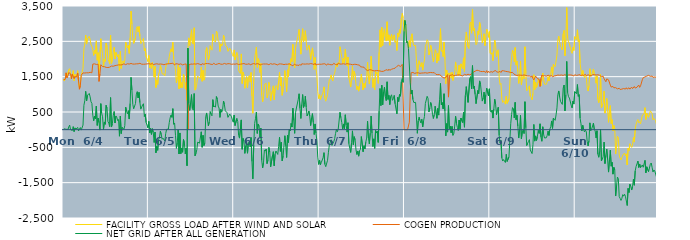
| Category | FACILITY GROSS LOAD AFTER WIND AND SOLAR | COGEN PRODUCTION | NET GRID AFTER ALL GENERATION |
|---|---|---|---|
|  Mon  6/4 | 1419 | 1411 | 8 |
|  Mon  6/4 | 1376 | 1393 | -17 |
|  Mon  6/4 | 1450 | 1423 | 27 |
|  Mon  6/4 | 1601 | 1609 | -8 |
|  Mon  6/4 | 1490 | 1466 | 24 |
|  Mon  6/4 | 1513 | 1519 | -6 |
|  Mon  6/4 | 1694 | 1616 | 78 |
|  Mon  6/4 | 1727 | 1598 | 129 |
|  Mon  6/4 | 1581 | 1581 | 0 |
|  Mon  6/4 | 1433 | 1438 | -5 |
|  Mon  6/4 | 1554 | 1576 | -22 |
|  Mon  6/4 | 1673 | 1588 | 85 |
|  Mon  6/4 | 1387 | 1440 | -53 |
|  Mon  6/4 | 1565 | 1514 | 51 |
|  Mon  6/4 | 1490 | 1476 | 14 |
|  Mon  6/4 | 1548 | 1527 | 21 |
|  Mon  6/4 | 1669 | 1605 | 64 |
|  Mon  6/4 | 1340 | 1376 | -36 |
|  Mon  6/4 | 1170 | 1145 | 25 |
|  Mon  6/4 | 1311 | 1251 | 60 |
|  Mon  6/4 | 1529 | 1541 | -12 |
|  Mon  6/4 | 1539 | 1528 | 11 |
|  Mon  6/4 | 1736 | 1606 | 130 |
|  Mon  6/4 | 2291 | 1603 | 688 |
|  Mon  6/4 | 2423 | 1604 | 819 |
|  Mon  6/4 | 2678 | 1594 | 1084 |
|  Mon  6/4 | 2421 | 1610 | 811 |
|  Mon  6/4 | 2566 | 1592 | 974 |
|  Mon  6/4 | 2592 | 1609 | 983 |
|  Mon  6/4 | 2643 | 1618 | 1025 |
|  Mon  6/4 | 2555 | 1624 | 931 |
|  Mon  6/4 | 2399 | 1610 | 789 |
|  Mon  6/4 | 2353 | 1610 | 743 |
|  Mon  6/4 | 2267 | 1856 | 411 |
|  Mon  6/4 | 2102 | 1849 | 253 |
|  Mon  6/4 | 2249 | 1863 | 386 |
|  Mon  6/4 | 2155 | 1847 | 308 |
|  Mon  6/4 | 2513 | 1845 | 668 |
|  Mon  6/4 | 1965 | 1845 | 120 |
|  Mon  6/4 | 2180 | 1853 | 327 |
|  Mon  6/4 | 1565 | 1366 | 199 |
|  Mon  6/4 | 1563 | 1575 | -12 |
|  Mon  6/4 | 2573 | 1837 | 736 |
|  Mon  6/4 | 2285 | 1825 | 460 |
|  Mon  6/4 | 2154 | 1789 | 365 |
|  Mon  6/4 | 1769 | 1768 | 1 |
|  Mon  6/4 | 2000 | 1782 | 218 |
|  Mon  6/4 | 1933 | 1781 | 152 |
|  Mon  6/4 | 2451 | 1763 | 688 |
|  Mon  6/4 | 2358 | 1751 | 607 |
|  Mon  6/4 | 1992 | 1758 | 234 |
|  Mon  6/4 | 1944 | 1759 | 185 |
|  Mon  6/4 | 1855 | 1769 | 86 |
|  Mon  6/4 | 2678 | 1771 | 907 |
|  Mon  6/4 | 1875 | 1800 | 75 |
|  Mon  6/4 | 1979 | 1809 | 170 |
|  Mon  6/4 | 2190 | 1795 | 395 |
|  Mon  6/4 | 2331 | 1817 | 514 |
|  Mon  6/4 | 2000 | 1812 | 188 |
|  Mon  6/4 | 2187 | 1799 | 388 |
|  Mon  6/4 | 2171 | 1823 | 348 |
|  Mon  6/4 | 2061 | 1804 | 257 |
|  Mon  6/4 | 2121 | 1834 | 287 |
|  Mon  6/4 | 1664 | 1849 | -185 |
|  Mon  6/4 | 2218 | 1832 | 386 |
|  Mon  6/4 | 1732 | 1843 | -111 |
|  Mon  6/4 | 1904 | 1837 | 67 |
|  Mon  6/4 | 1949 | 1859 | 90 |
|  Mon  6/4 | 1872 | 1864 | 8 |
|  Mon  6/4 | 1971 | 1857 | 114 |
|  Mon  6/4 | 2477 | 1840 | 637 |
|  Mon  6/4 | 2381 | 1863 | 518 |
|  Mon  6/4 | 2312 | 1866 | 446 |
|  Mon  6/4 | 2392 | 1853 | 539 |
|  Mon  6/4 | 2158 | 1857 | 301 |
|  Mon  6/4 | 2595 | 1853 | 742 |
|  Mon  6/4 | 3354 | 1874 | 1480 |
|  Mon  6/4 | 2983 | 1864 | 1119 |
|  Mon  6/4 | 2572 | 1857 | 715 |
|  Mon  6/4 | 2442 | 1851 | 591 |
|  Mon  6/4 | 2457 | 1856 | 601 |
|  Mon  6/4 | 2600 | 1861 | 739 |
|  Mon  6/4 | 2869 | 1863 | 1006 |
|  Mon  6/4 | 2918 | 1843 | 1075 |
|  Mon  6/4 | 2762 | 1864 | 898 |
|  Mon  6/4 | 2918 | 1862 | 1056 |
|  Mon  6/4 | 2644 | 1878 | 766 |
|  Mon  6/4 | 2434 | 1853 | 581 |
|  Mon  6/4 | 2419 | 1853 | 566 |
|  Mon  6/4 | 2536 | 1837 | 699 |
|  Mon  6/4 | 2585 | 1851 | 734 |
|  Mon  6/4 | 2230 | 1858 | 372 |
|  Mon  6/4 | 2293 | 1855 | 438 |
|  Mon  6/4 | 2062 | 1860 | 202 |
|  Mon  6/4 | 2052 | 1862 | 190 |
|  Mon  6/4 | 1925 | 1872 | 53 |
|  Tue  6/5 | 2100 | 1867 | 233 |
|  Tue  6/5 | 1754 | 1847 | -93 |
|  Tue  6/5 | 1889 | 1855 | 34 |
|  Tue  6/5 | 1729 | 1863 | -134 |
|  Tue  6/5 | 1899 | 1871 | 28 |
|  Tue  6/5 | 1766 | 1839 | -73 |
|  Tue  6/5 | 1484 | 1847 | -363 |
|  Tue  6/5 | 1787 | 1857 | -70 |
|  Tue  6/5 | 1192 | 1846 | -654 |
|  Tue  6/5 | 1394 | 1864 | -470 |
|  Tue  6/5 | 1281 | 1865 | -584 |
|  Tue  6/5 | 1568 | 1852 | -284 |
|  Tue  6/5 | 1639 | 1855 | -216 |
|  Tue  6/5 | 1817 | 1858 | -41 |
|  Tue  6/5 | 1714 | 1855 | -141 |
|  Tue  6/5 | 1582 | 1853 | -271 |
|  Tue  6/5 | 1604 | 1846 | -242 |
|  Tue  6/5 | 1571 | 1838 | -267 |
|  Tue  6/5 | 1523 | 1847 | -324 |
|  Tue  6/5 | 1746 | 1854 | -108 |
|  Tue  6/5 | 1864 | 1855 | 9 |
|  Tue  6/5 | 1858 | 1862 | -4 |
|  Tue  6/5 | 1875 | 1860 | 15 |
|  Tue  6/5 | 2067 | 1867 | 200 |
|  Tue  6/5 | 2193 | 1859 | 334 |
|  Tue  6/5 | 2287 | 1872 | 415 |
|  Tue  6/5 | 2204 | 1857 | 347 |
|  Tue  6/5 | 2473 | 1879 | 594 |
|  Tue  6/5 | 2003 | 1851 | 152 |
|  Tue  6/5 | 2017 | 1831 | 186 |
|  Tue  6/5 | 1704 | 1864 | -160 |
|  Tue  6/5 | 1322 | 1850 | -528 |
|  Tue  6/5 | 1484 | 1863 | -379 |
|  Tue  6/5 | 1834 | 1840 | -6 |
|  Tue  6/5 | 1158 | 1847 | -689 |
|  Tue  6/5 | 1757 | 1850 | -93 |
|  Tue  6/5 | 1183 | 1863 | -680 |
|  Tue  6/5 | 1333 | 1850 | -517 |
|  Tue  6/5 | 1193 | 1832 | -639 |
|  Tue  6/5 | 1571 | 1850 | -279 |
|  Tue  6/5 | 1479 | 1851 | -372 |
|  Tue  6/5 | 1147 | 1830 | -683 |
|  Tue  6/5 | 1343 | 1861 | -518 |
|  Tue  6/5 | 833 | 1854 | -1021 |
|  Tue  6/5 | 2307 | 0 | 2307 |
|  Tue  6/5 | 2599 | 1861 | 738 |
|  Tue  6/5 | 2377 | 1831 | 546 |
|  Tue  6/5 | 2633 | 1860 | 773 |
|  Tue  6/5 | 2828 | 1836 | 992 |
|  Tue  6/5 | 2452 | 1853 | 599 |
|  Tue  6/5 | 2420 | 1867 | 553 |
|  Tue  6/5 | 2885 | 1862 | 1023 |
|  Tue  6/5 | 1119 | 1856 | -737 |
|  Tue  6/5 | 1179 | 1855 | -676 |
|  Tue  6/5 | 1304 | 1871 | -567 |
|  Tue  6/5 | 1520 | 1871 | -351 |
|  Tue  6/5 | 1480 | 1849 | -369 |
|  Tue  6/5 | 1471 | 1854 | -383 |
|  Tue  6/5 | 1452 | 1832 | -380 |
|  Tue  6/5 | 1770 | 1830 | -60 |
|  Tue  6/5 | 1369 | 1868 | -499 |
|  Tue  6/5 | 1683 | 1842 | -159 |
|  Tue  6/5 | 1400 | 1849 | -449 |
|  Tue  6/5 | 1476 | 1853 | -377 |
|  Tue  6/5 | 2234 | 1871 | 363 |
|  Tue  6/5 | 2324 | 1851 | 473 |
|  Tue  6/5 | 2145 | 1870 | 275 |
|  Tue  6/5 | 1968 | 1863 | 105 |
|  Tue  6/5 | 2089 | 1866 | 223 |
|  Tue  6/5 | 2377 | 1865 | 512 |
|  Tue  6/5 | 2290 | 1849 | 441 |
|  Tue  6/5 | 2250 | 1858 | 392 |
|  Tue  6/5 | 2697 | 1847 | 850 |
|  Tue  6/5 | 2521 | 1879 | 642 |
|  Tue  6/5 | 2542 | 1870 | 672 |
|  Tue  6/5 | 2480 | 1844 | 636 |
|  Tue  6/5 | 2791 | 1854 | 937 |
|  Tue  6/5 | 2722 | 1856 | 866 |
|  Tue  6/5 | 2515 | 1848 | 667 |
|  Tue  6/5 | 2486 | 1874 | 612 |
|  Tue  6/5 | 2213 | 1866 | 347 |
|  Tue  6/5 | 2429 | 1853 | 576 |
|  Tue  6/5 | 2364 | 1871 | 493 |
|  Tue  6/5 | 2425 | 1851 | 574 |
|  Tue  6/5 | 2675 | 1864 | 811 |
|  Tue  6/5 | 2586 | 1874 | 712 |
|  Tue  6/5 | 2396 | 1860 | 536 |
|  Tue  6/5 | 2369 | 1854 | 515 |
|  Tue  6/5 | 2337 | 1858 | 479 |
|  Tue  6/5 | 2216 | 1868 | 348 |
|  Tue  6/5 | 2207 | 1872 | 335 |
|  Tue  6/5 | 2305 | 1866 | 439 |
|  Tue  6/5 | 2286 | 1878 | 408 |
|  Tue  6/5 | 2214 | 1850 | 364 |
|  Tue  6/5 | 2129 | 1853 | 276 |
|  Tue  6/5 | 2070 | 1857 | 213 |
|  Wed  6/6 | 2257 | 1845 | 412 |
|  Wed  6/6 | 1971 | 1854 | 117 |
|  Wed  6/6 | 1965 | 1855 | 110 |
|  Wed  6/6 | 2184 | 1866 | 318 |
|  Wed  6/6 | 2105 | 1870 | 235 |
|  Wed  6/6 | 1680 | 1845 | -165 |
|  Wed  6/6 | 1624 | 1863 | -239 |
|  Wed  6/6 | 1590 | 1853 | -263 |
|  Wed  6/6 | 2144 | 1868 | 276 |
|  Wed  6/6 | 1306 | 1862 | -556 |
|  Wed  6/6 | 1628 | 1875 | -247 |
|  Wed  6/6 | 1544 | 1871 | -327 |
|  Wed  6/6 | 1172 | 1843 | -671 |
|  Wed  6/6 | 1395 | 1851 | -456 |
|  Wed  6/6 | 1503 | 1862 | -359 |
|  Wed  6/6 | 1187 | 1853 | -666 |
|  Wed  6/6 | 1479 | 1851 | -372 |
|  Wed  6/6 | 1534 | 1867 | -333 |
|  Wed  6/6 | 1345 | 1832 | -487 |
|  Wed  6/6 | 1617 | 1840 | -223 |
|  Wed  6/6 | 956 | 1856 | -900 |
|  Wed  6/6 | 464 | 1856 | -1392 |
|  Wed  6/6 | 1431 | 1872 | -441 |
|  Wed  6/6 | 2032 | 1857 | 175 |
|  Wed  6/6 | 2173 | 1853 | 320 |
|  Wed  6/6 | 2337 | 1838 | 499 |
|  Wed  6/6 | 1764 | 1870 | -106 |
|  Wed  6/6 | 2013 | 1852 | 161 |
|  Wed  6/6 | 1951 | 1856 | 95 |
|  Wed  6/6 | 1619 | 1827 | -208 |
|  Wed  6/6 | 1877 | 1836 | 41 |
|  Wed  6/6 | 981 | 1851 | -870 |
|  Wed  6/6 | 789 | 1872 | -1083 |
|  Wed  6/6 | 933 | 1859 | -926 |
|  Wed  6/6 | 1281 | 1853 | -572 |
|  Wed  6/6 | 1253 | 1858 | -605 |
|  Wed  6/6 | 1311 | 1860 | -549 |
|  Wed  6/6 | 900 | 1859 | -959 |
|  Wed  6/6 | 996 | 1862 | -866 |
|  Wed  6/6 | 1339 | 1839 | -500 |
|  Wed  6/6 | 1221 | 1857 | -636 |
|  Wed  6/6 | 815 | 1869 | -1054 |
|  Wed  6/6 | 810 | 1870 | -1060 |
|  Wed  6/6 | 1105 | 1851 | -746 |
|  Wed  6/6 | 1241 | 1864 | -623 |
|  Wed  6/6 | 842 | 1865 | -1023 |
|  Wed  6/6 | 1166 | 1860 | -694 |
|  Wed  6/6 | 1247 | 1850 | -603 |
|  Wed  6/6 | 1218 | 1845 | -627 |
|  Wed  6/6 | 1127 | 1828 | -701 |
|  Wed  6/6 | 1385 | 1859 | -474 |
|  Wed  6/6 | 1625 | 1841 | -216 |
|  Wed  6/6 | 1247 | 1861 | -614 |
|  Wed  6/6 | 1481 | 1836 | -355 |
|  Wed  6/6 | 973 | 1855 | -882 |
|  Wed  6/6 | 1128 | 1876 | -748 |
|  Wed  6/6 | 1391 | 1842 | -451 |
|  Wed  6/6 | 1672 | 1844 | -172 |
|  Wed  6/6 | 1395 | 1853 | -458 |
|  Wed  6/6 | 1072 | 1859 | -787 |
|  Wed  6/6 | 1692 | 1851 | -159 |
|  Wed  6/6 | 1491 | 1853 | -362 |
|  Wed  6/6 | 1878 | 1862 | 16 |
|  Wed  6/6 | 1810 | 1846 | -36 |
|  Wed  6/6 | 2010 | 1834 | 176 |
|  Wed  6/6 | 1926 | 1852 | 74 |
|  Wed  6/6 | 2416 | 1809 | 607 |
|  Wed  6/6 | 2084 | 1828 | 256 |
|  Wed  6/6 | 1754 | 1858 | -104 |
|  Wed  6/6 | 2307 | 1827 | 480 |
|  Wed  6/6 | 2445 | 1831 | 614 |
|  Wed  6/6 | 2454 | 1826 | 628 |
|  Wed  6/6 | 2676 | 1827 | 849 |
|  Wed  6/6 | 2835 | 1819 | 1016 |
|  Wed  6/6 | 2448 | 1848 | 600 |
|  Wed  6/6 | 2136 | 1819 | 317 |
|  Wed  6/6 | 2578 | 1864 | 714 |
|  Wed  6/6 | 2858 | 1865 | 993 |
|  Wed  6/6 | 2488 | 1858 | 630 |
|  Wed  6/6 | 2570 | 1859 | 711 |
|  Wed  6/6 | 2801 | 1855 | 946 |
|  Wed  6/6 | 2494 | 1855 | 639 |
|  Wed  6/6 | 2250 | 1862 | 388 |
|  Wed  6/6 | 2300 | 1853 | 447 |
|  Wed  6/6 | 2385 | 1856 | 529 |
|  Wed  6/6 | 2244 | 1862 | 382 |
|  Wed  6/6 | 1986 | 1870 | 116 |
|  Wed  6/6 | 2194 | 1862 | 332 |
|  Wed  6/6 | 2315 | 1861 | 454 |
|  Wed  6/6 | 2086 | 1886 | 200 |
|  Wed  6/6 | 1705 | 1843 | -138 |
|  Wed  6/6 | 2044 | 1882 | 162 |
|  Wed  6/6 | 1731 | 1830 | -99 |
|  Wed  6/6 | 1539 | 1842 | -303 |
|  Wed  6/6 | 1074 | 1851 | -777 |
|  Wed  6/6 | 881 | 1864 | -983 |
|  Thu  6/7 | 990 | 1852 | -862 |
|  Thu  6/7 | 852 | 1845 | -993 |
|  Thu  6/7 | 922 | 1851 | -929 |
|  Thu  6/7 | 915 | 1865 | -950 |
|  Thu  6/7 | 1069 | 1861 | -792 |
|  Thu  6/7 | 1211 | 1862 | -651 |
|  Thu  6/7 | 885 | 1865 | -980 |
|  Thu  6/7 | 806 | 1853 | -1047 |
|  Thu  6/7 | 804 | 1824 | -1020 |
|  Thu  6/7 | 995 | 1862 | -867 |
|  Thu  6/7 | 1215 | 1855 | -640 |
|  Thu  6/7 | 1412 | 1847 | -435 |
|  Thu  6/7 | 1446 | 1860 | -414 |
|  Thu  6/7 | 1549 | 1836 | -287 |
|  Thu  6/7 | 1416 | 1858 | -442 |
|  Thu  6/7 | 1375 | 1842 | -467 |
|  Thu  6/7 | 1538 | 1878 | -340 |
|  Thu  6/7 | 1597 | 1851 | -254 |
|  Thu  6/7 | 1732 | 1844 | -112 |
|  Thu  6/7 | 1868 | 1859 | 9 |
|  Thu  6/7 | 1774 | 1833 | -59 |
|  Thu  6/7 | 1899 | 1882 | 17 |
|  Thu  6/7 | 1867 | 1864 | 3 |
|  Thu  6/7 | 2347 | 1856 | 491 |
|  Thu  6/7 | 2208 | 1870 | 338 |
|  Thu  6/7 | 2060 | 1858 | 202 |
|  Thu  6/7 | 1870 | 1854 | 16 |
|  Thu  6/7 | 2027 | 1865 | 162 |
|  Thu  6/7 | 1883 | 1855 | 28 |
|  Thu  6/7 | 2273 | 1852 | 421 |
|  Thu  6/7 | 1984 | 1860 | 124 |
|  Thu  6/7 | 1800 | 1869 | -69 |
|  Thu  6/7 | 2050 | 1854 | 196 |
|  Thu  6/7 | 1460 | 1858 | -398 |
|  Thu  6/7 | 1349 | 1874 | -525 |
|  Thu  6/7 | 1207 | 1851 | -644 |
|  Thu  6/7 | 1471 | 1841 | -370 |
|  Thu  6/7 | 1804 | 1838 | -34 |
|  Thu  6/7 | 1421 | 1846 | -425 |
|  Thu  6/7 | 1652 | 1850 | -198 |
|  Thu  6/7 | 1557 | 1844 | -287 |
|  Thu  6/7 | 1278 | 1848 | -570 |
|  Thu  6/7 | 1136 | 1838 | -702 |
|  Thu  6/7 | 1231 | 1834 | -603 |
|  Thu  6/7 | 1090 | 1840 | -750 |
|  Thu  6/7 | 1229 | 1826 | -597 |
|  Thu  6/7 | 1223 | 1781 | -558 |
|  Thu  6/7 | 1574 | 1770 | -196 |
|  Thu  6/7 | 1558 | 1773 | -215 |
|  Thu  6/7 | 1124 | 1747 | -623 |
|  Thu  6/7 | 1313 | 1767 | -454 |
|  Thu  6/7 | 1189 | 1737 | -548 |
|  Thu  6/7 | 1350 | 1704 | -354 |
|  Thu  6/7 | 1461 | 1699 | -238 |
|  Thu  6/7 | 1912 | 1671 | 241 |
|  Thu  6/7 | 1450 | 1689 | -239 |
|  Thu  6/7 | 1292 | 1695 | -403 |
|  Thu  6/7 | 1595 | 1694 | -99 |
|  Thu  6/7 | 2079 | 1692 | 387 |
|  Thu  6/7 | 1617 | 1717 | -100 |
|  Thu  6/7 | 1192 | 1670 | -478 |
|  Thu  6/7 | 1436 | 1696 | -260 |
|  Thu  6/7 | 1134 | 1663 | -529 |
|  Thu  6/7 | 1654 | 1678 | -24 |
|  Thu  6/7 | 1579 | 1675 | -96 |
|  Thu  6/7 | 1621 | 1663 | -42 |
|  Thu  6/7 | 1308 | 1668 | -360 |
|  Thu  6/7 | 2190 | 1664 | 526 |
|  Thu  6/7 | 2826 | 1661 | 1165 |
|  Thu  6/7 | 2336 | 1654 | 682 |
|  Thu  6/7 | 2905 | 1648 | 1257 |
|  Thu  6/7 | 2380 | 1676 | 704 |
|  Thu  6/7 | 2733 | 1654 | 1079 |
|  Thu  6/7 | 2854 | 1652 | 1202 |
|  Thu  6/7 | 2614 | 1680 | 934 |
|  Thu  6/7 | 2507 | 1685 | 822 |
|  Thu  6/7 | 3054 | 1699 | 1355 |
|  Thu  6/7 | 2526 | 1670 | 856 |
|  Thu  6/7 | 2683 | 1713 | 970 |
|  Thu  6/7 | 2390 | 1680 | 710 |
|  Thu  6/7 | 2627 | 1688 | 939 |
|  Thu  6/7 | 2697 | 1710 | 987 |
|  Thu  6/7 | 2525 | 1694 | 831 |
|  Thu  6/7 | 2605 | 1727 | 878 |
|  Thu  6/7 | 2683 | 1715 | 968 |
|  Thu  6/7 | 2472 | 1741 | 731 |
|  Thu  6/7 | 2508 | 1758 | 750 |
|  Thu  6/7 | 2239 | 1792 | 447 |
|  Thu  6/7 | 2733 | 1818 | 915 |
|  Thu  6/7 | 2620 | 1822 | 798 |
|  Thu  6/7 | 2830 | 1830 | 1000 |
|  Thu  6/7 | 2730 | 1785 | 945 |
|  Thu  6/7 | 3149 | 1795 | 1354 |
|  Thu  6/7 | 3291 | 1848 | 1443 |
|  Thu  6/7 | 3166 | 1825 | 1341 |
|  Thu  6/7 | 2786 | 0 | 2786 |
|  Fri  6/8 | 3094 | 0 | 3094 |
|  Fri  6/8 | 2955 | 0 | 2955 |
|  Fri  6/8 | 2457 | 0 | 2457 |
|  Fri  6/8 | 2495 | 0 | 2495 |
|  Fri  6/8 | 2297 | 0 | 2297 |
|  Fri  6/8 | 2522 | 212 | 2310 |
|  Fri  6/8 | 2336 | 1011 | 1325 |
|  Fri  6/8 | 2618 | 1610 | 1008 |
|  Fri  6/8 | 2714 | 1595 | 1119 |
|  Fri  6/8 | 2474 | 1620 | 854 |
|  Fri  6/8 | 2381 | 1613 | 768 |
|  Fri  6/8 | 2384 | 1593 | 791 |
|  Fri  6/8 | 2385 | 1613 | 772 |
|  Fri  6/8 | 2394 | 1607 | 787 |
|  Fri  6/8 | 1519 | 1621 | -102 |
|  Fri  6/8 | 1860 | 1608 | 252 |
|  Fri  6/8 | 1953 | 1601 | 352 |
|  Fri  6/8 | 1850 | 1595 | 255 |
|  Fri  6/8 | 1777 | 1587 | 190 |
|  Fri  6/8 | 1898 | 1603 | 295 |
|  Fri  6/8 | 1685 | 1606 | 79 |
|  Fri  6/8 | 1859 | 1605 | 254 |
|  Fri  6/8 | 1974 | 1600 | 374 |
|  Fri  6/8 | 2353 | 1612 | 741 |
|  Fri  6/8 | 2432 | 1592 | 840 |
|  Fri  6/8 | 2544 | 1600 | 944 |
|  Fri  6/8 | 2501 | 1615 | 886 |
|  Fri  6/8 | 2115 | 1612 | 503 |
|  Fri  6/8 | 2219 | 1606 | 613 |
|  Fri  6/8 | 2388 | 1619 | 769 |
|  Fri  6/8 | 2282 | 1604 | 678 |
|  Fri  6/8 | 2049 | 1613 | 436 |
|  Fri  6/8 | 1918 | 1601 | 317 |
|  Fri  6/8 | 2041 | 1614 | 427 |
|  Fri  6/8 | 2263 | 1600 | 663 |
|  Fri  6/8 | 2202 | 1563 | 639 |
|  Fri  6/8 | 1885 | 1563 | 322 |
|  Fri  6/8 | 2159 | 1558 | 601 |
|  Fri  6/8 | 1953 | 1541 | 412 |
|  Fri  6/8 | 2404 | 1558 | 846 |
|  Fri  6/8 | 2858 | 1550 | 1308 |
|  Fri  6/8 | 2218 | 1520 | 698 |
|  Fri  6/8 | 2254 | 1488 | 766 |
|  Fri  6/8 | 2067 | 1478 | 589 |
|  Fri  6/8 | 2478 | 1461 | 1017 |
|  Fri  6/8 | 1997 | 1467 | 530 |
|  Fri  6/8 | 1297 | 1474 | -177 |
|  Fri  6/8 | 1689 | 1517 | 172 |
|  Fri  6/8 | 1489 | 1558 | -69 |
|  Fri  6/8 | 1602 | 921 | 681 |
|  Fri  6/8 | 1558 | 1531 | 27 |
|  Fri  6/8 | 1611 | 1511 | 100 |
|  Fri  6/8 | 1456 | 1543 | -87 |
|  Fri  6/8 | 1622 | 1529 | 93 |
|  Fri  6/8 | 1394 | 1555 | -161 |
|  Fri  6/8 | 1414 | 1525 | -111 |
|  Fri  6/8 | 1619 | 1518 | 101 |
|  Fri  6/8 | 1917 | 1537 | 380 |
|  Fri  6/8 | 1723 | 1549 | 174 |
|  Fri  6/8 | 1609 | 1546 | 63 |
|  Fri  6/8 | 1525 | 1546 | -21 |
|  Fri  6/8 | 1825 | 1552 | 273 |
|  Fri  6/8 | 1553 | 1531 | 22 |
|  Fri  6/8 | 1863 | 1534 | 329 |
|  Fri  6/8 | 1793 | 1540 | 253 |
|  Fri  6/8 | 1720 | 1521 | 199 |
|  Fri  6/8 | 2033 | 1544 | 489 |
|  Fri  6/8 | 1635 | 1565 | 70 |
|  Fri  6/8 | 2512 | 1541 | 971 |
|  Fri  6/8 | 2765 | 1547 | 1218 |
|  Fri  6/8 | 2782 | 1558 | 1224 |
|  Fri  6/8 | 2342 | 1570 | 772 |
|  Fri  6/8 | 2296 | 1551 | 745 |
|  Fri  6/8 | 3000 | 1550 | 1450 |
|  Fri  6/8 | 3047 | 1545 | 1502 |
|  Fri  6/8 | 2730 | 1577 | 1153 |
|  Fri  6/8 | 3401 | 1588 | 1813 |
|  Fri  6/8 | 2798 | 1630 | 1168 |
|  Fri  6/8 | 2876 | 1640 | 1236 |
|  Fri  6/8 | 2651 | 1655 | 996 |
|  Fri  6/8 | 2403 | 1667 | 736 |
|  Fri  6/8 | 2447 | 1683 | 764 |
|  Fri  6/8 | 2783 | 1674 | 1109 |
|  Fri  6/8 | 2693 | 1672 | 1021 |
|  Fri  6/8 | 3037 | 1657 | 1380 |
|  Fri  6/8 | 2937 | 1649 | 1288 |
|  Fri  6/8 | 2922 | 1644 | 1278 |
|  Fri  6/8 | 2452 | 1643 | 809 |
|  Fri  6/8 | 2551 | 1655 | 896 |
|  Fri  6/8 | 2714 | 1651 | 1063 |
|  Fri  6/8 | 2378 | 1643 | 735 |
|  Fri  6/8 | 2610 | 1618 | 992 |
|  Fri  6/8 | 2845 | 1671 | 1174 |
|  Fri  6/8 | 2773 | 1607 | 1166 |
|  Fri  6/8 | 2614 | 1656 | 958 |
|  Fri  6/8 | 2776 | 1620 | 1156 |
|  Sat  6/9 | 2162 | 1627 | 535 |
|  Sat  6/9 | 2133 | 1642 | 491 |
|  Sat  6/9 | 2179 | 1623 | 556 |
|  Sat  6/9 | 1953 | 1625 | 328 |
|  Sat  6/9 | 2240 | 1655 | 585 |
|  Sat  6/9 | 2536 | 1673 | 863 |
|  Sat  6/9 | 2396 | 1674 | 722 |
|  Sat  6/9 | 2058 | 1637 | 421 |
|  Sat  6/9 | 2230 | 1663 | 567 |
|  Sat  6/9 | 2261 | 1625 | 636 |
|  Sat  6/9 | 1470 | 1633 | -163 |
|  Sat  6/9 | 1276 | 1651 | -375 |
|  Sat  6/9 | 1310 | 1618 | -308 |
|  Sat  6/9 | 869 | 1668 | -799 |
|  Sat  6/9 | 771 | 1659 | -888 |
|  Sat  6/9 | 820 | 1666 | -846 |
|  Sat  6/9 | 789 | 1659 | -870 |
|  Sat  6/9 | 722 | 1652 | -930 |
|  Sat  6/9 | 945 | 1643 | -698 |
|  Sat  6/9 | 744 | 1643 | -899 |
|  Sat  6/9 | 750 | 1637 | -887 |
|  Sat  6/9 | 865 | 1635 | -770 |
|  Sat  6/9 | 1315 | 1617 | -302 |
|  Sat  6/9 | 1786 | 1617 | 169 |
|  Sat  6/9 | 2047 | 1614 | 433 |
|  Sat  6/9 | 2246 | 1621 | 625 |
|  Sat  6/9 | 2182 | 1589 | 593 |
|  Sat  6/9 | 1924 | 1591 | 333 |
|  Sat  6/9 | 2325 | 1552 | 773 |
|  Sat  6/9 | 1826 | 1543 | 283 |
|  Sat  6/9 | 1942 | 1534 | 408 |
|  Sat  6/9 | 1645 | 1543 | 102 |
|  Sat  6/9 | 1309 | 1546 | -237 |
|  Sat  6/9 | 1574 | 1550 | 24 |
|  Sat  6/9 | 1946 | 1541 | 405 |
|  Sat  6/9 | 1276 | 1533 | -257 |
|  Sat  6/9 | 1473 | 1539 | -66 |
|  Sat  6/9 | 1523 | 1517 | 6 |
|  Sat  6/9 | 1437 | 1548 | -111 |
|  Sat  6/9 | 2346 | 1555 | 791 |
|  Sat  6/9 | 1588 | 1535 | 53 |
|  Sat  6/9 | 1099 | 1546 | -447 |
|  Sat  6/9 | 1133 | 1519 | -386 |
|  Sat  6/9 | 1185 | 1518 | -333 |
|  Sat  6/9 | 1239 | 1520 | -281 |
|  Sat  6/9 | 944 | 1522 | -578 |
|  Sat  6/9 | 913 | 1484 | -571 |
|  Sat  6/9 | 848 | 1524 | -676 |
|  Sat  6/9 | 1024 | 1448 | -424 |
|  Sat  6/9 | 1556 | 1409 | 147 |
|  Sat  6/9 | 1134 | 1458 | -324 |
|  Sat  6/9 | 1341 | 1517 | -176 |
|  Sat  6/9 | 1198 | 1504 | -306 |
|  Sat  6/9 | 1256 | 1447 | -191 |
|  Sat  6/9 | 1435 | 1453 | -18 |
|  Sat  6/9 | 1320 | 1425 | -105 |
|  Sat  6/9 | 1389 | 1223 | 166 |
|  Sat  6/9 | 1241 | 1448 | -207 |
|  Sat  6/9 | 1221 | 1549 | -328 |
|  Sat  6/9 | 1602 | 1520 | 82 |
|  Sat  6/9 | 1398 | 1535 | -137 |
|  Sat  6/9 | 1291 | 1526 | -235 |
|  Sat  6/9 | 1286 | 1516 | -230 |
|  Sat  6/9 | 1282 | 1512 | -230 |
|  Sat  6/9 | 1353 | 1518 | -165 |
|  Sat  6/9 | 1501 | 1543 | -42 |
|  Sat  6/9 | 1380 | 1544 | -164 |
|  Sat  6/9 | 1529 | 1517 | 12 |
|  Sat  6/9 | 1595 | 1509 | 86 |
|  Sat  6/9 | 1776 | 1529 | 247 |
|  Sat  6/9 | 1529 | 1494 | 35 |
|  Sat  6/9 | 1850 | 1522 | 328 |
|  Sat  6/9 | 1817 | 1521 | 296 |
|  Sat  6/9 | 1781 | 1517 | 264 |
|  Sat  6/9 | 1949 | 1529 | 420 |
|  Sat  6/9 | 2120 | 1503 | 617 |
|  Sat  6/9 | 2538 | 1546 | 992 |
|  Sat  6/9 | 2643 | 1547 | 1096 |
|  Sat  6/9 | 2467 | 1540 | 927 |
|  Sat  6/9 | 2353 | 1553 | 800 |
|  Sat  6/9 | 2321 | 1548 | 773 |
|  Sat  6/9 | 2259 | 1544 | 715 |
|  Sat  6/9 | 2710 | 1535 | 1175 |
|  Sat  6/9 | 2810 | 1546 | 1264 |
|  Sat  6/9 | 2092 | 1558 | 534 |
|  Sat  6/9 | 2545 | 1554 | 991 |
|  Sat  6/9 | 3454 | 1523 | 1931 |
|  Sat  6/9 | 2596 | 1551 | 1045 |
|  Sat  6/9 | 2482 | 1549 | 933 |
|  Sat  6/9 | 2435 | 1541 | 894 |
|  Sat  6/9 | 2443 | 1549 | 894 |
|  Sat  6/9 | 2222 | 1530 | 692 |
|  Sat  6/9 | 2160 | 1542 | 618 |
|  Sat  6/9 | 2333 | 1526 | 807 |
|  Sat  6/9 | 2242 | 1518 | 724 |
|  Sat  6/9 | 2633 | 1556 | 1077 |
|  Sun  6/10 | 2639 | 1550 | 1089 |
|  Sun  6/10 | 2553 | 1535 | 1018 |
|  Sun  6/10 | 2827 | 1550 | 1277 |
|  Sun  6/10 | 2489 | 1548 | 941 |
|  Sun  6/10 | 2543 | 1551 | 992 |
|  Sun  6/10 | 1881 | 1556 | 325 |
|  Sun  6/10 | 1691 | 1522 | 169 |
|  Sun  6/10 | 1516 | 1551 | -35 |
|  Sun  6/10 | 1674 | 1551 | 123 |
|  Sun  6/10 | 1541 | 1535 | 6 |
|  Sun  6/10 | 1473 | 1538 | -65 |
|  Sun  6/10 | 1552 | 1566 | -14 |
|  Sun  6/10 | 1473 | 1528 | -55 |
|  Sun  6/10 | 1189 | 1525 | -336 |
|  Sun  6/10 | 1093 | 1553 | -460 |
|  Sun  6/10 | 1237 | 1548 | -311 |
|  Sun  6/10 | 1725 | 1532 | 193 |
|  Sun  6/10 | 1508 | 1536 | -28 |
|  Sun  6/10 | 1543 | 1528 | 15 |
|  Sun  6/10 | 1563 | 1558 | 5 |
|  Sun  6/10 | 1717 | 1534 | 183 |
|  Sun  6/10 | 1563 | 1558 | 5 |
|  Sun  6/10 | 1504 | 1540 | -36 |
|  Sun  6/10 | 1315 | 1548 | -233 |
|  Sun  6/10 | 1522 | 1552 | -30 |
|  Sun  6/10 | 861 | 1554 | -693 |
|  Sun  6/10 | 765 | 1546 | -781 |
|  Sun  6/10 | 925 | 1537 | -612 |
|  Sun  6/10 | 1565 | 1555 | 10 |
|  Sun  6/10 | 618 | 1503 | -885 |
|  Sun  6/10 | 690 | 1531 | -841 |
|  Sun  6/10 | 757 | 1512 | -755 |
|  Sun  6/10 | 1090 | 1442 | -352 |
|  Sun  6/10 | 467 | 1427 | -960 |
|  Sun  6/10 | 629 | 1357 | -728 |
|  Sun  6/10 | 888 | 1437 | -549 |
|  Sun  6/10 | 565 | 1417 | -852 |
|  Sun  6/10 | 209 | 1410 | -1201 |
|  Sun  6/10 | 526 | 1384 | -858 |
|  Sun  6/10 | 680 | 1261 | -581 |
|  Sun  6/10 | 172 | 1206 | -1034 |
|  Sun  6/10 | 282 | 1206 | -924 |
|  Sun  6/10 | -36 | 1223 | -1259 |
|  Sun  6/10 | 119 | 1185 | -1066 |
|  Sun  6/10 | 34 | 1174 | -1140 |
|  Sun  6/10 | -689 | 1189 | -1878 |
|  Sun  6/10 | -422 | 1175 | -1597 |
|  Sun  6/10 | -187 | 1155 | -1342 |
|  Sun  6/10 | -217 | 1169 | -1386 |
|  Sun  6/10 | -720 | 1172 | -1892 |
|  Sun  6/10 | -805 | 1137 | -1942 |
|  Sun  6/10 | -855 | 1147 | -2002 |
|  Sun  6/10 | -794 | 1148 | -1942 |
|  Sun  6/10 | -718 | 1121 | -1839 |
|  Sun  6/10 | -718 | 1164 | -1882 |
|  Sun  6/10 | -661 | 1167 | -1828 |
|  Sun  6/10 | -737 | 1148 | -1885 |
|  Sun  6/10 | -684 | 1186 | -1870 |
|  Sun  6/10 | -998 | 1148 | -2146 |
|  Sun  6/10 | -523 | 1139 | -1662 |
|  Sun  6/10 | -594 | 1185 | -1779 |
|  Sun  6/10 | -399 | 1147 | -1546 |
|  Sun  6/10 | -446 | 1157 | -1603 |
|  Sun  6/10 | -502 | 1206 | -1708 |
|  Sun  6/10 | -448 | 1161 | -1609 |
|  Sun  6/10 | -222 | 1182 | -1404 |
|  Sun  6/10 | -351 | 1222 | -1573 |
|  Sun  6/10 | 11 | 1177 | -1166 |
|  Sun  6/10 | 156 | 1198 | -1042 |
|  Sun  6/10 | 235 | 1201 | -966 |
|  Sun  6/10 | 287 | 1177 | -890 |
|  Sun  6/10 | 194 | 1264 | -1070 |
|  Sun  6/10 | 226 | 1197 | -971 |
|  Sun  6/10 | 167 | 1240 | -1073 |
|  Sun  6/10 | 143 | 1218 | -1075 |
|  Sun  6/10 | 413 | 1412 | -999 |
|  Sun  6/10 | 408 | 1472 | -1064 |
|  Sun  6/10 | 448 | 1493 | -1045 |
|  Sun  6/10 | 624 | 1493 | -869 |
|  Sun  6/10 | 289 | 1510 | -1221 |
|  Sun  6/10 | 466 | 1516 | -1050 |
|  Sun  6/10 | 455 | 1528 | -1073 |
|  Sun  6/10 | 349 | 1537 | -1188 |
|  Sun  6/10 | 344 | 1530 | -1186 |
|  Sun  6/10 | 531 | 1509 | -978 |
|  Sun  6/10 | 554 | 1497 | -943 |
|  Sun  6/10 | 452 | 1517 | -1065 |
|  Sun  6/10 | 281 | 1480 | -1199 |
|  Sun  6/10 | 317 | 1457 | -1140 |
|  Sun  6/10 | 320 | 1492 | -1172 |
|  Sun  6/10 | 256 | 1512 | -1256 |
|  Sun  6/10 | 139 | 1482 | -1343 |